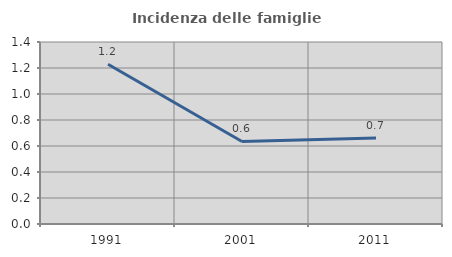
| Category | Incidenza delle famiglie numerose |
|---|---|
| 1991.0 | 1.229 |
| 2001.0 | 0.635 |
| 2011.0 | 0.661 |